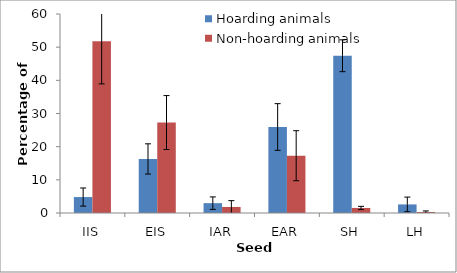
| Category | Hoarding animals | Non-hoarding animals |
|---|---|---|
| IIS | 4.81 | 51.82 |
| EIS | 16.3 | 27.27 |
| IAR | 2.97 | 1.82 |
| EAR | 25.93 | 17.27 |
| SH | 47.41 | 1.52 |
| LH | 2.59 | 0.3 |